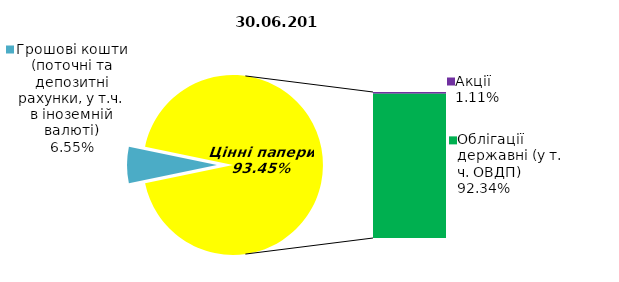
| Category | Series 0 |
|---|---|
| Грошові кошти (поточні та депозитні рахунки, у т.ч. в іноземній валюті) | 7.05 |
| Банківські метали | 0 |
| Нерухомість | 0 |
| Інші активи | 0 |
| Акції | 1.198 |
| Облігації підприємств | 0 |
| Муніципальні облігації | 0 |
| Облігації державні (у т. ч. ОВДП) | 99.382 |
| Іпотечні сертифікати | 0 |